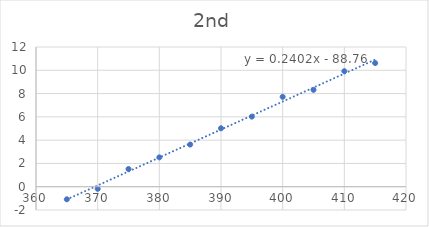
| Category | Series 0 |
|---|---|
| 365.0 | -1.08 |
| 370.0 | -0.18 |
| 375.0 | 1.52 |
| 380.0 | 2.52 |
| 385.0 | 3.62 |
| 390.0 | 5.02 |
| 395.0 | 6.02 |
| 400.0 | 7.72 |
| 405.0 | 8.32 |
| 410.0 | 9.92 |
| 415.0 | 10.62 |